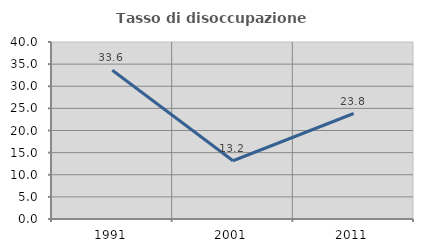
| Category | Tasso di disoccupazione giovanile  |
|---|---|
| 1991.0 | 33.613 |
| 2001.0 | 13.169 |
| 2011.0 | 23.841 |